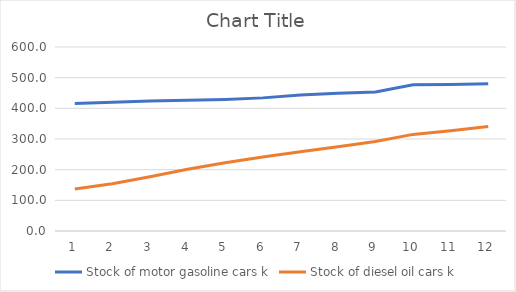
| Category | Stock of motor gasoline cars | Stock of diesel oil cars |
|---|---|---|
| 0 | 415.578 | 137.082 |
| 1 | 420 | 154 |
| 2 | 424.3 | 177.2 |
| 3 | 426.4 | 201.3 |
| 4 | 429 | 222.7 |
| 5 | 434.1 | 241 |
| 6 | 443.1 | 258.4 |
| 7 | 449.3 | 274.8 |
| 8 | 453 | 291.6 |
| 9 | 477.2 | 315 |
| 10 | 478.1 | 326.7 |
| 11 | 480.3 | 340.6 |